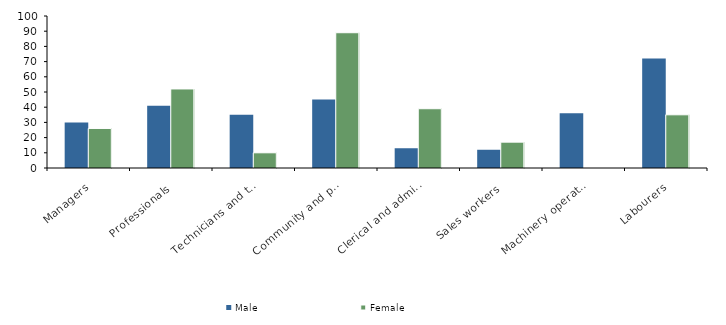
| Category | Male | Female |
|---|---|---|
| Managers | 30 | 26 |
| Professionals | 41 | 52 |
| Technicians and trades workers | 35 | 10 |
| Community and personal service workers | 45 | 89 |
| Clerical and administrative workers | 13 | 39 |
| Sales workers | 12 | 17 |
| Machinery operators and drivers | 36 | 0 |
| Labourers | 72 | 35 |